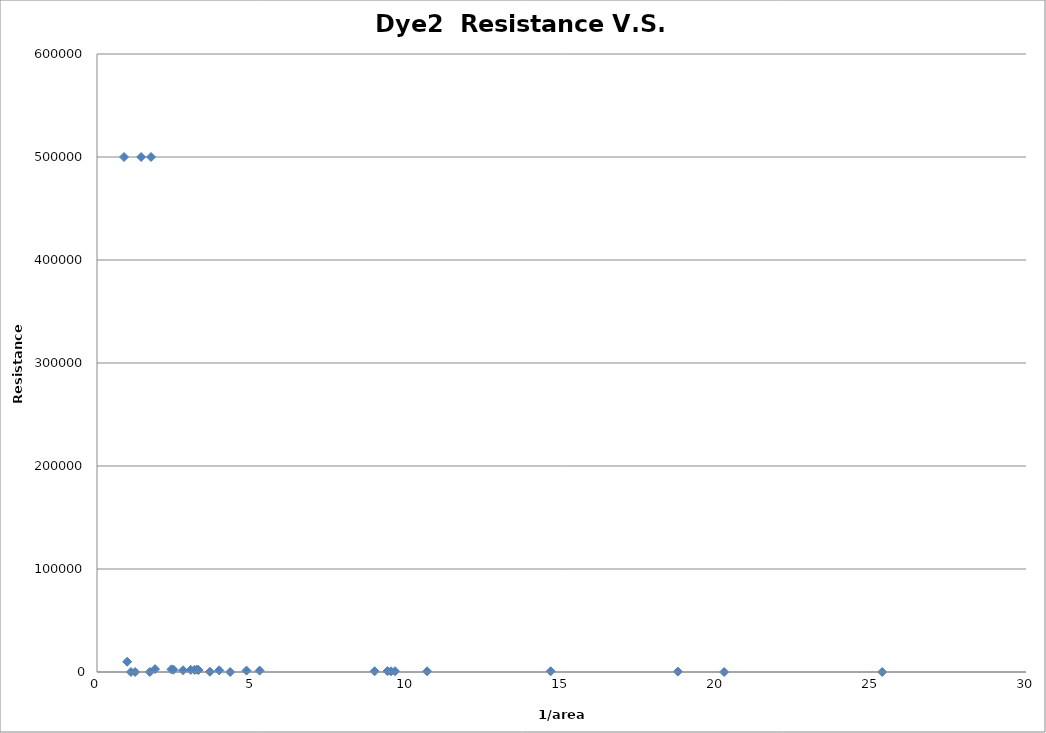
| Category | Series 0 |
|---|---|
| 0.976 | 9963.654 |
| 1.2317 | 0 |
| 0.8720000000000001 | 500000 |
| 1.744 | 500000 |
| 1.0960999999999999 | 0 |
| 3.232 | 2317.674 |
| 2.4034 | 2552.368 |
| 1.8748 | 2851.852 |
| 1.7063 | 0 |
| 1.4260000000000002 | 500000 |
| 3.152 | 2069.894 |
| 3.2761 | 1849.252 |
| 2.4696 | 2248.666 |
| 3.0272 | 2099.24 |
| 2.7782999999999998 | 1670.043 |
| 3.6476999999999995 | 205.861 |
| 5.252000000000001 | 1363.938 |
| 3.9458 | 1637.984 |
| 4.8278 | 1392.478 |
| 4.3008 | 0 |
| 9.3786 | 837.059 |
| 10.660599999999999 | 664.902 |
| 9.625399999999999 | 762.689 |
| 8.9639 | 716.321 |
| 9.495199999999999 | 678.26 |
| 20.252100000000002 | 0 |
| 25.3575 | 0 |
| 18.7572 | 390.081 |
| 14.649600000000001 | 688.541 |